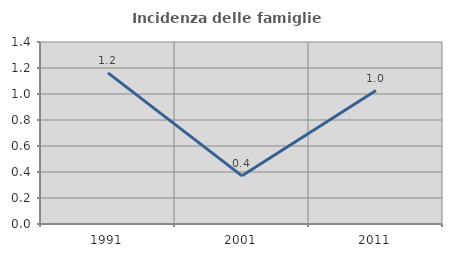
| Category | Incidenza delle famiglie numerose |
|---|---|
| 1991.0 | 1.163 |
| 2001.0 | 0.37 |
| 2011.0 | 1.027 |